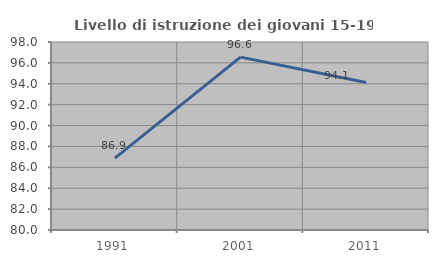
| Category | Livello di istruzione dei giovani 15-19 anni |
|---|---|
| 1991.0 | 86.885 |
| 2001.0 | 96.552 |
| 2011.0 | 94.118 |